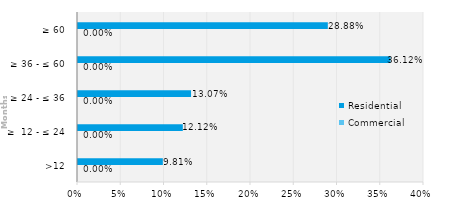
| Category | Commercial | Residential |
|---|---|---|
| >12 | 0 | 0.098 |
| ≥  12 - ≤ 24 | 0 | 0.121 |
| ≥ 24 - ≤ 36 | 0 | 0.131 |
| ≥ 36 - ≤ 60 | 0 | 0.361 |
| ≥ 60 | 0 | 0.289 |